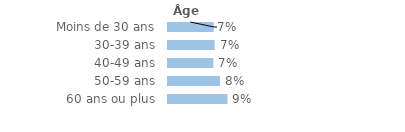
| Category | Series 0 |
|---|---|
| Moins de 30 ans | 0.073 |
| 30-39 ans | 0.074 |
| 40-49 ans | 0.072 |
| 50-59 ans | 0.083 |
| 60 ans ou plus | 0.094 |